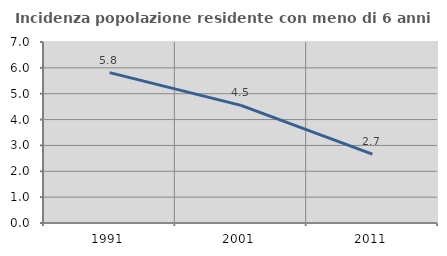
| Category | Incidenza popolazione residente con meno di 6 anni |
|---|---|
| 1991.0 | 5.816 |
| 2001.0 | 4.549 |
| 2011.0 | 2.665 |